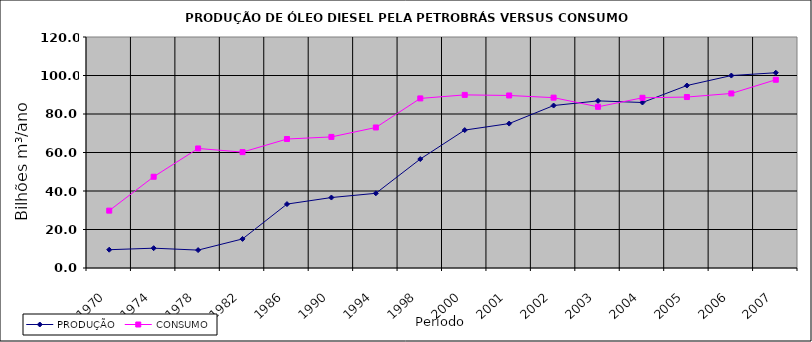
| Category | PRODUÇÃO | CONSUMO |
|---|---|---|
| 1970.0 | 9.5 | 29.8 |
| 1974.0 | 10.3 | 47.4 |
| 1978.0 | 9.3 | 62.1 |
| 1982.0 | 15.1 | 60.2 |
| 1986.0 | 33.2 | 67 |
| 1990.0 | 36.6 | 68.1 |
| 1994.0 | 38.8 | 73 |
| 1998.0 | 56.6 | 88.1 |
| 2000.0 | 71.644 | 89.93 |
| 2001.0 | 75.02 | 89.625 |
| 2002.0 | 84.399 | 88.497 |
| 2003.0 | 86.82 | 83.734 |
| 2004.0 | 85.967 | 88.42 |
| 2005.0 | 94.797 | 88.807 |
| 2006.0 | 99.971 | 90.673 |
| 2007.0 | 101.437 | 97.786 |